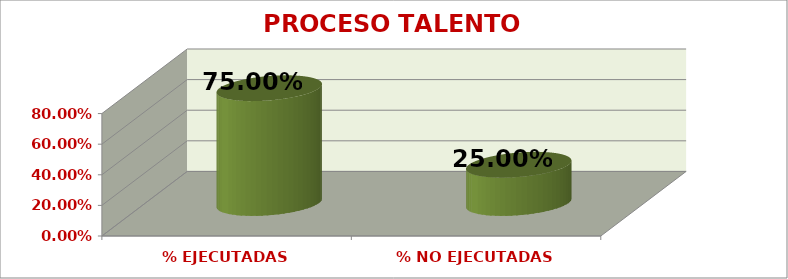
| Category | PROCESO TALENTO HUMANO |
|---|---|
| % EJECUTADAS | 0.75 |
| % NO EJECUTADAS | 0.25 |